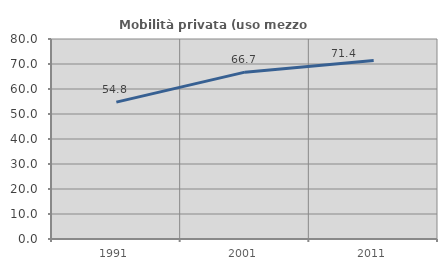
| Category | Mobilità privata (uso mezzo privato) |
|---|---|
| 1991.0 | 54.757 |
| 2001.0 | 66.74 |
| 2011.0 | 71.395 |